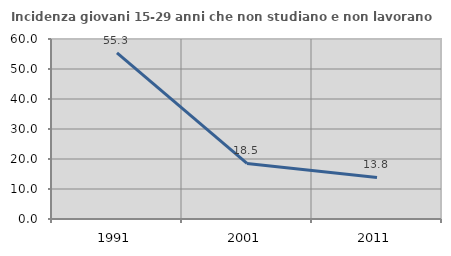
| Category | Incidenza giovani 15-29 anni che non studiano e non lavorano  |
|---|---|
| 1991.0 | 55.345 |
| 2001.0 | 18.519 |
| 2011.0 | 13.846 |